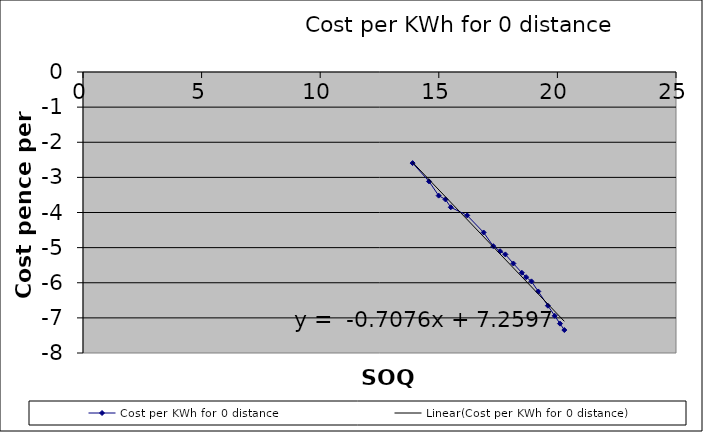
| Category | Cost per KWh for 0 distance |
|---|---|
| 20.292175181199273 | -7.346 |
| 20.109853624405318 | -7.164 |
| 19.88671007309111 | -6.941 |
| 19.59902800063933 | -6.653 |
| 19.193562892531165 | -6.248 |
| 18.905880820079382 | -5.96 |
| 18.682737268765173 | -5.841 |
| 18.50041571197122 | -5.716 |
| 18.143740768032487 | -5.452 |
| 17.807268531411275 | -5.193 |
| 17.584124980097062 | -5.103 |
| 17.296442907645282 | -4.958 |
| 16.89097779953712 | -4.569 |
| 16.197830618977175 | -4.083 |
| 15.504683438417228 | -3.851 |
| 15.281539887103019 | -3.628 |
| 14.993857814651237 | -3.52 |
| 14.588392706543074 | -3.114 |
| 13.895245525983128 | -2.594 |